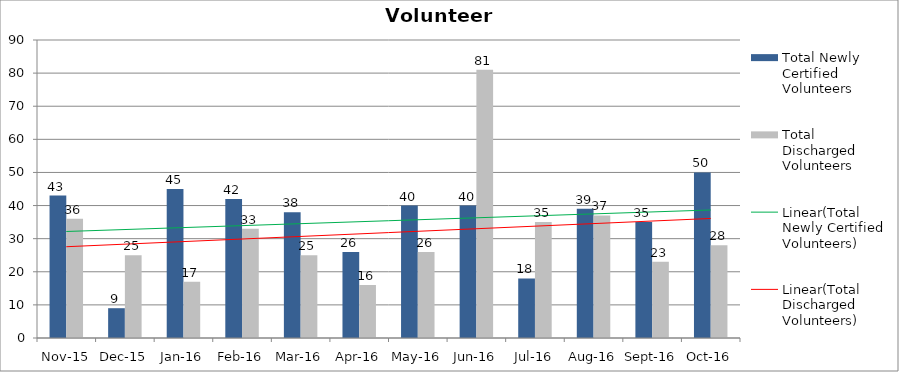
| Category | Total Newly Certified Volunteers | Total Discharged Volunteers |
|---|---|---|
| Nov-15 | 43 | 36 |
| Dec-15 | 9 | 25 |
| Jan-16 | 45 | 17 |
| Feb-16 | 42 | 33 |
| Mar-16 | 38 | 25 |
| Apr-16 | 26 | 16 |
| May-16 | 40 | 26 |
| Jun-16 | 40 | 81 |
| Jul-16 | 18 | 35 |
| Aug-16 | 39 | 37 |
| Sep-16 | 35 | 23 |
| Oct-16 | 50 | 28 |